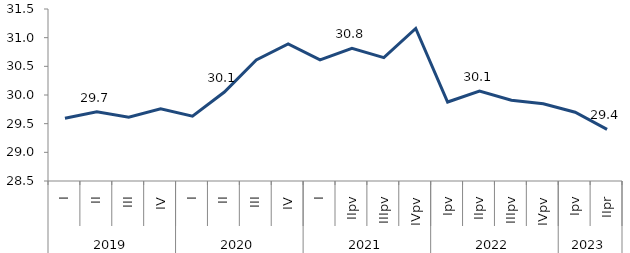
| Category | Series 0 |
|---|---|
| 0 | 29.595 |
| 1 | 29.707 |
| 2 | 29.612 |
| 3 | 29.758 |
| 4 | 29.631 |
| 5 | 30.051 |
| 6 | 30.612 |
| 7 | 30.89 |
| 8 | 30.612 |
| 9 | 30.813 |
| 10 | 30.651 |
| 11 | 31.16 |
| 12 | 29.877 |
| 13 | 30.067 |
| 14 | 29.908 |
| 15 | 29.848 |
| 16 | 29.7 |
| 17 | 29.4 |